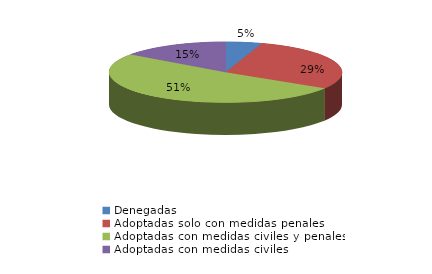
| Category | Series 0 |
|---|---|
| Denegadas | 12 |
| Adoptadas solo con medidas penales | 69 |
| Adoptadas con medidas civiles y penales | 122 |
| Adoptadas con medidas civiles | 36 |